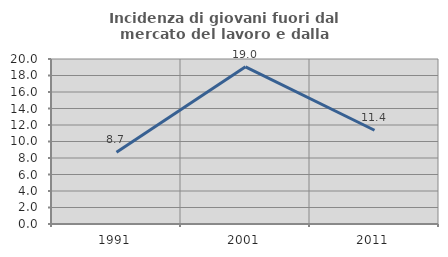
| Category | Incidenza di giovani fuori dal mercato del lavoro e dalla formazione  |
|---|---|
| 1991.0 | 8.696 |
| 2001.0 | 19.048 |
| 2011.0 | 11.364 |